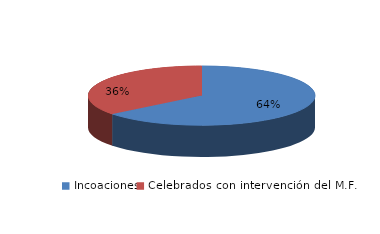
| Category | Series 0 |
|---|---|
| Incoaciones | 3537 |
| Celebrados con intervención del M.F. | 1960 |